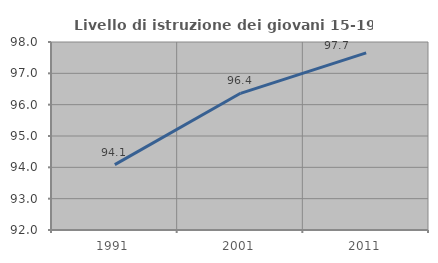
| Category | Livello di istruzione dei giovani 15-19 anni |
|---|---|
| 1991.0 | 94.087 |
| 2001.0 | 96.363 |
| 2011.0 | 97.655 |